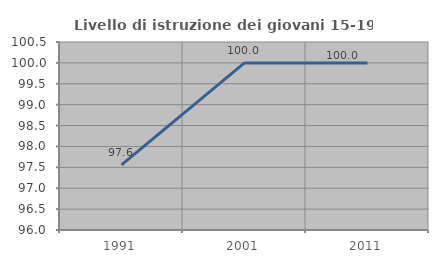
| Category | Livello di istruzione dei giovani 15-19 anni |
|---|---|
| 1991.0 | 97.561 |
| 2001.0 | 100 |
| 2011.0 | 100 |